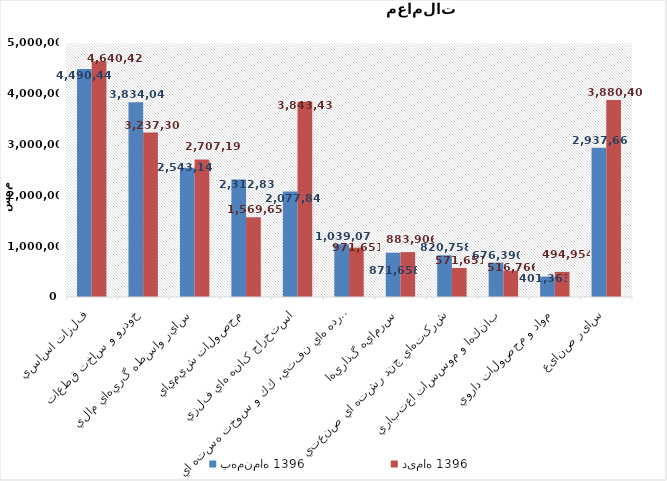
| Category | بهمن‌ماه 1396 | دی‌ماه 1396 |
|---|---|---|
| فلزات اساسي | 4490446.381 | 4640420.828 |
| خودرو و ساخت قطعات | 3834041.942 | 3237305.177 |
| ساير واسطه گريهاي مالي | 2543147.418 | 2707190.239 |
| محصولات شيميايي | 2312837.897 | 1569657 |
| استخراج کانه هاي فلزي | 2077842.271 | 3843437.63 |
| فراورده هاي نفتي، كك و سوخت هسته اي | 1039072.92 | 971651.026 |
| سرمايه گذاريها | 871658.009 | 883906.218 |
| شرکتهاي چند رشته اي صنعتي | 820758.097 | 571651.107 |
| بانكها و موسسات اعتباري | 676390.356 | 516765.755 |
| مواد و محصولات دارويي | 401362.982 | 494954.009 |
| سایر صنایع | 2937661.148 | 3880407.922 |